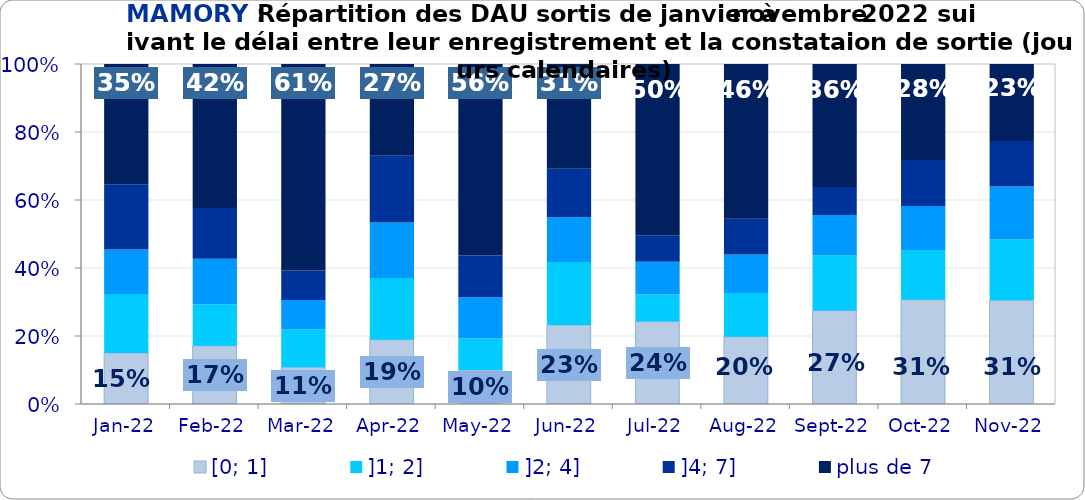
| Category | [0; 1] | ]1; 2] | ]2; 4] | ]4; 7] | plus de 7 |
|---|---|---|---|---|---|
| 2022-01-01 | 0.15 | 0.173 | 0.131 | 0.192 | 0.354 |
| 2022-02-01 | 0.171 | 0.122 | 0.134 | 0.149 | 0.423 |
| 2022-03-01 | 0.108 | 0.111 | 0.087 | 0.086 | 0.608 |
| 2022-04-01 | 0.189 | 0.182 | 0.163 | 0.197 | 0.27 |
| 2022-05-01 | 0.1 | 0.093 | 0.121 | 0.123 | 0.563 |
| 2022-06-01 | 0.232 | 0.186 | 0.131 | 0.143 | 0.308 |
| 2022-07-01 | 0.242 | 0.08 | 0.096 | 0.078 | 0.504 |
| 2022-08-01 | 0.198 | 0.129 | 0.113 | 0.105 | 0.455 |
| 2022-09-01 | 0.275 | 0.163 | 0.118 | 0.083 | 0.362 |
| 2022-10-01 | 0.306 | 0.147 | 0.129 | 0.135 | 0.282 |
| 2022-11-01 | 0.305 | 0.178 | 0.156 | 0.134 | 0.227 |